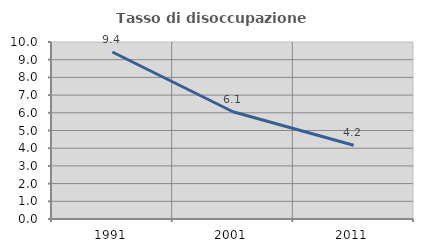
| Category | Tasso di disoccupazione giovanile  |
|---|---|
| 1991.0 | 9.434 |
| 2001.0 | 6.061 |
| 2011.0 | 4.167 |